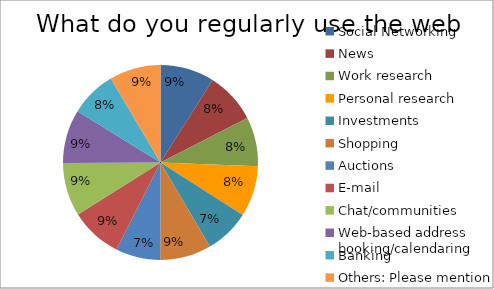
| Category | Options |
|---|---|
| Social Networking | 98 |
| News | 93 |
| Work research | 89 |
| Personal research | 92 |
| Investments | 82 |
| Shopping | 93 |
| Auctions | 81 |
| E-mail | 94 |
| Chat/communities | 97 |
| Web-based address booking/calendaring | 97 |
| Banking | 84 |
| Others: Please mention | 93 |